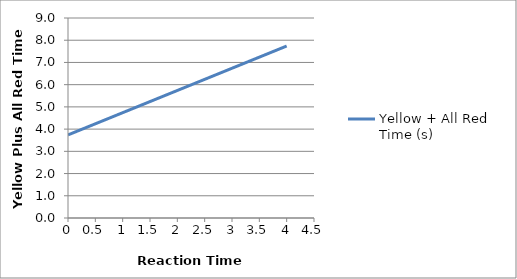
| Category | Yellow + All Red Time (s) |
|---|---|
| 0.0 | 3.739 |
| 0.2 | 3.939 |
| 0.4 | 4.139 |
| 0.6 | 4.339 |
| 0.8 | 4.539 |
| 1.0 | 4.739 |
| 1.2 | 4.939 |
| 1.4 | 5.139 |
| 1.6 | 5.339 |
| 1.8 | 5.539 |
| 2.0 | 5.739 |
| 2.2 | 5.939 |
| 2.4 | 6.139 |
| 2.6 | 6.339 |
| 2.8 | 6.539 |
| 3.0 | 6.739 |
| 3.2 | 6.939 |
| 3.4 | 7.139 |
| 3.6 | 7.339 |
| 3.8 | 7.539 |
| 4.0 | 7.739 |